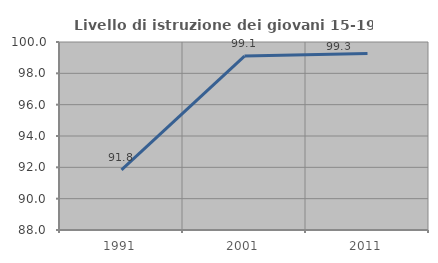
| Category | Livello di istruzione dei giovani 15-19 anni |
|---|---|
| 1991.0 | 91.837 |
| 2001.0 | 99.099 |
| 2011.0 | 99.27 |